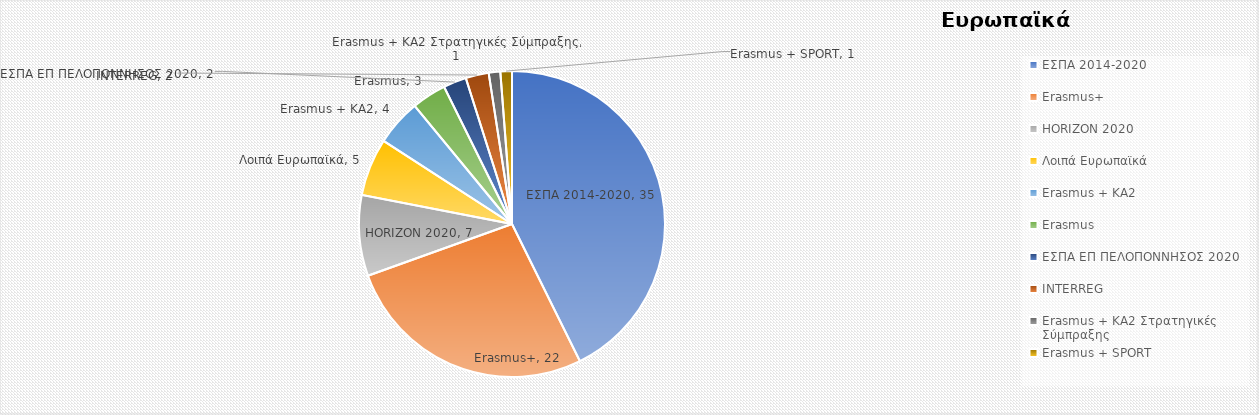
| Category | Έργα |
|---|---|
| ΕΣΠΑ 2014-2020 | 35 |
| Erasmus+ | 22 |
| HORIZON 2020 | 7 |
| Λοιπά Ευρωπαϊκά | 5 |
| Erasmus + KA2 | 4 |
| Erasmus | 3 |
| ΕΣΠΑ ΕΠ ΠΕΛΟΠΟΝΝΗΣΟΣ 2020 | 2 |
| INTERREG | 2 |
| Erasmus + KA2 Στρατηγικές Σύμπραξης | 1 |
| Erasmus + SPORT | 1 |